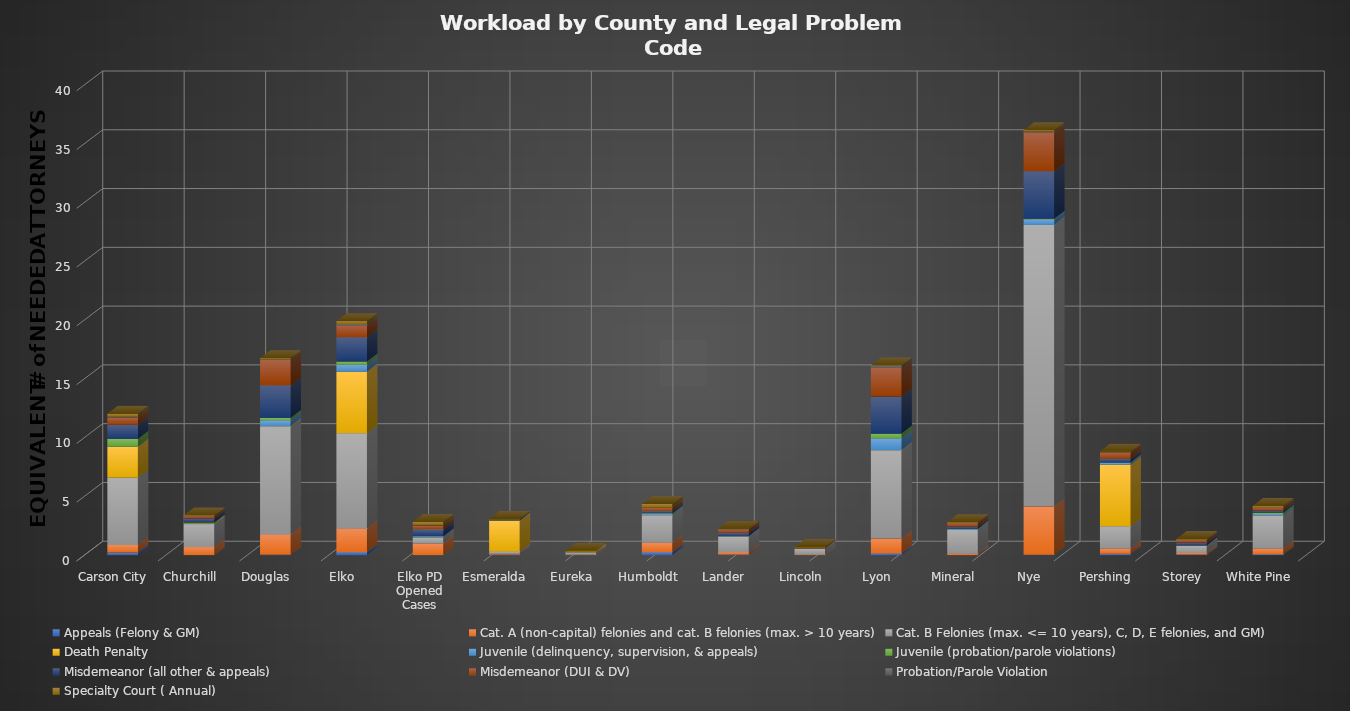
| Category | Appeals (Felony & GM) | Cat. A (non-capital) felonies and cat. B felonies (max. > 10 years) | Cat. B Felonies (max. <= 10 years), C, D, E felonies, and GM) | Death Penalty | Juvenile (delinquency, supervision, & appeals) | Juvenile (probation/parole violations) | Misdemeanor (all other & appeals) | Misdemeanor (DUI & DV) | Probation/Parole Violation | Specialty Court ( Annual) |
|---|---|---|---|---|---|---|---|---|---|---|
| Carson City | 0.215 | 0.646 | 5.73 | 2.619 | 0.016 | 0.653 | 1.202 | 0.603 | 0.078 | 0.259 |
| Churchill | 0 | 0.682 | 1.953 | 0 | 0.048 | 0.075 | 0.34 | 0.208 | 0.009 | 0.065 |
| Douglas | 0.036 | 1.723 | 9.206 | 0 | 0.49 | 0.205 | 2.77 | 2.161 | 0.026 | 0.129 |
| Elko | 0.251 | 2.011 | 8.1 | 5.239 | 0.582 | 0.28 | 2.064 | 1.012 | 0.103 | 0.259 |
| Elko PD Opened Cases | 0 | 0.969 | 0.503 | 0 | 0.118 | 0 | 0.599 | 0.323 | 0.046 | 0.259 |
| Esmeralda | 0.036 | 0.072 | 0.201 | 2.619 | 0 | 0.019 | 0.017 | 0.05 | 0 | 0.065 |
| Eureka | 0 | 0.036 | 0.201 | 0 | 0.005 | 0 | 0.026 | 0.036 | 0 | 0.065 |
| Humboldt | 0.251 | 0.79 | 2.327 | 0 | 0.118 | 0.056 | 0.198 | 0.28 | 0.009 | 0.323 |
| Lander | 0.036 | 0.215 | 1.307 | 0 | 0.043 | 0 | 0.284 | 0.287 | 0.006 | 0.065 |
| Lincoln | 0 | 0.072 | 0.474 | 0 | 0 | 0 | 0.039 | 0.043 | 0.003 | 0.065 |
| Lyon | 0.144 | 1.257 | 7.525 | 0 | 0.991 | 0.411 | 3.158 | 2.427 | 0.158 | 0.065 |
| Mineral | 0 | 0.144 | 2.011 | 0 | 0.075 | 0 | 0.185 | 0.309 | 0.02 | 0.065 |
| Nye | 0.036 | 4.093 | 23.955 | 0 | 0.479 | 0.037 | 4.05 | 3.303 | 0.063 | 0.129 |
| Pershing | 0.108 | 0.431 | 1.91 | 5.239 | 0.145 | 0.037 | 0.306 | 0.539 | 0.032 | 0.065 |
| Storey | 0.036 | 0.144 | 0.632 | 0 | 0 | 0 | 0.246 | 0.223 | 0.026 | 0.065 |
| White Pine | 0.072 | 0.467 | 2.801 | 0 | 0.14 | 0.112 | 0.185 | 0.259 | 0.017 | 0.129 |